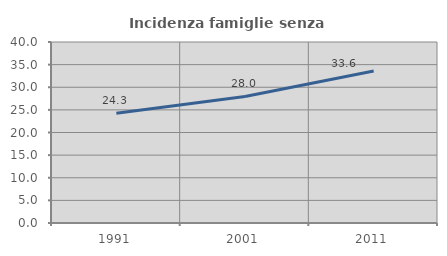
| Category | Incidenza famiglie senza nuclei |
|---|---|
| 1991.0 | 24.256 |
| 2001.0 | 27.956 |
| 2011.0 | 33.597 |